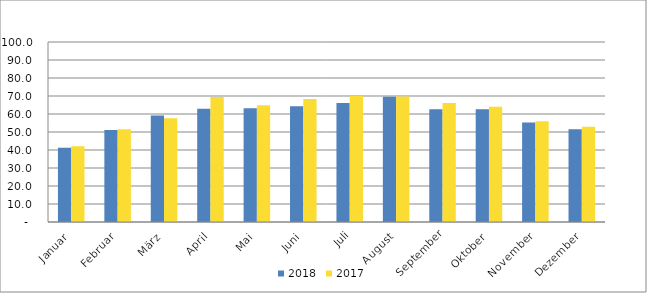
| Category | 2018 | 2017 |
|---|---|---|
| Januar | 41.306 | 42.096 |
| Februar | 51.093 | 51.56 |
| März | 59.196 | 57.576 |
| April | 62.919 | 69.46 |
| Mai | 63.214 | 64.83 |
| Juni | 64.277 | 68.267 |
| Juli | 66.112 | 69.937 |
| August | 69.57 | 69.751 |
| September | 62.644 | 66.174 |
| Oktober | 62.622 | 64.044 |
| November | 55.221 | 55.943 |
| Dezember | 51.465 | 52.929 |